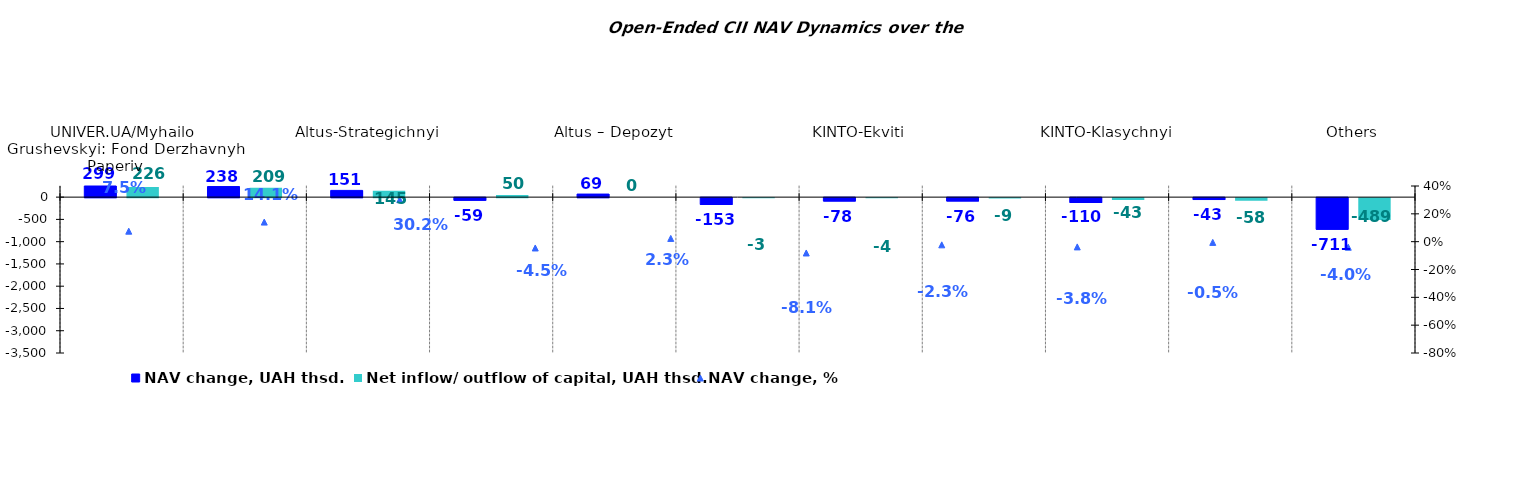
| Category | NAV change, UAH thsd. | Net inflow/ outflow of capital, UAH thsd. |
|---|---|---|
| UNIVER.UA/Myhailo Grushevskyi: Fond Derzhavnyh Paperiv    | 298.903 | 226.052 |
| VSI | 237.506 | 208.813 |
| Altus-Strategichnyi | 151.107 | 144.842 |
| Argentum | -59.378 | 50.349 |
| Altus – Depozyt | 68.796 | 0 |
| OTP Fond Aktsii | -152.967 | -3.245 |
| KINTO-Ekviti | -77.594 | -3.559 |
| KINTO-Kaznacheyskyi | -75.801 | -9.425 |
| KINTO-Klasychnyi | -109.612 | -42.893 |
| OTP Klasychnyi  | -42.874 | -58.02 |
| Others | -711.089 | -488.776 |